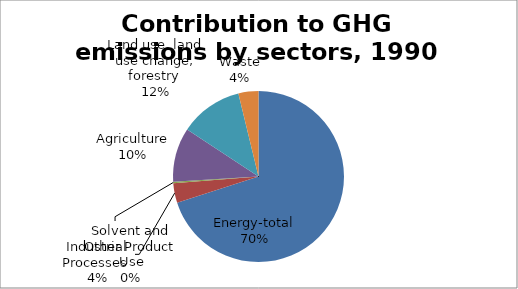
| Category | 1990 |
|---|---|
| Energy-total | 34.521 |
| Industrial Processes  | 1.842 |
| Solvent and Other Product Use | 0.126 |
| Agriculture | 5.064 |
| Land use, land use change, forestry  | -5.887 |
| Waste | 1.865 |